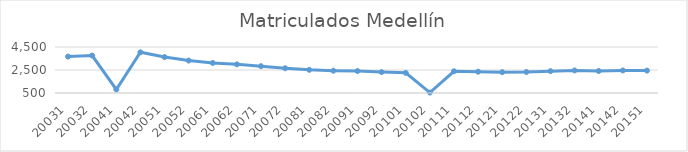
| Category | Matriculados Medellín |
|---|---|
| 20031 | 3668 |
| 20032 | 3759 |
| 20041 | 808 |
| 20042 | 4040 |
| 20051 | 3625 |
| 20052 | 3322 |
| 20061 | 3112 |
| 20062 | 2990 |
| 20071 | 2833 |
| 20072 | 2652 |
| 20081 | 2516 |
| 20082 | 2440 |
| 20091 | 2408 |
| 20092 | 2318 |
| 20101 | 2254 |
| 20102 | 537 |
| 20111 | 2389 |
| 20112 | 2351 |
| 20121 | 2311 |
| 20122 | 2327 |
| 20131 | 2401 |
| 20132 | 2463 |
| 20141 | 2414 |
| 20142 | 2458 |
| 20151 | 2449 |